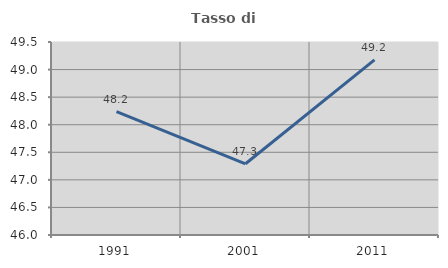
| Category | Tasso di occupazione   |
|---|---|
| 1991.0 | 48.238 |
| 2001.0 | 47.292 |
| 2011.0 | 49.177 |